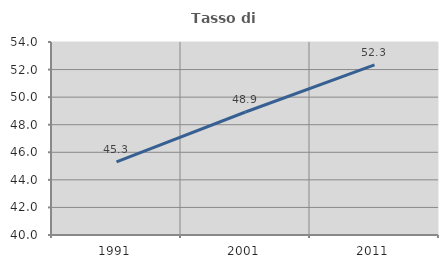
| Category | Tasso di occupazione   |
|---|---|
| 1991.0 | 45.298 |
| 2001.0 | 48.922 |
| 2011.0 | 52.345 |